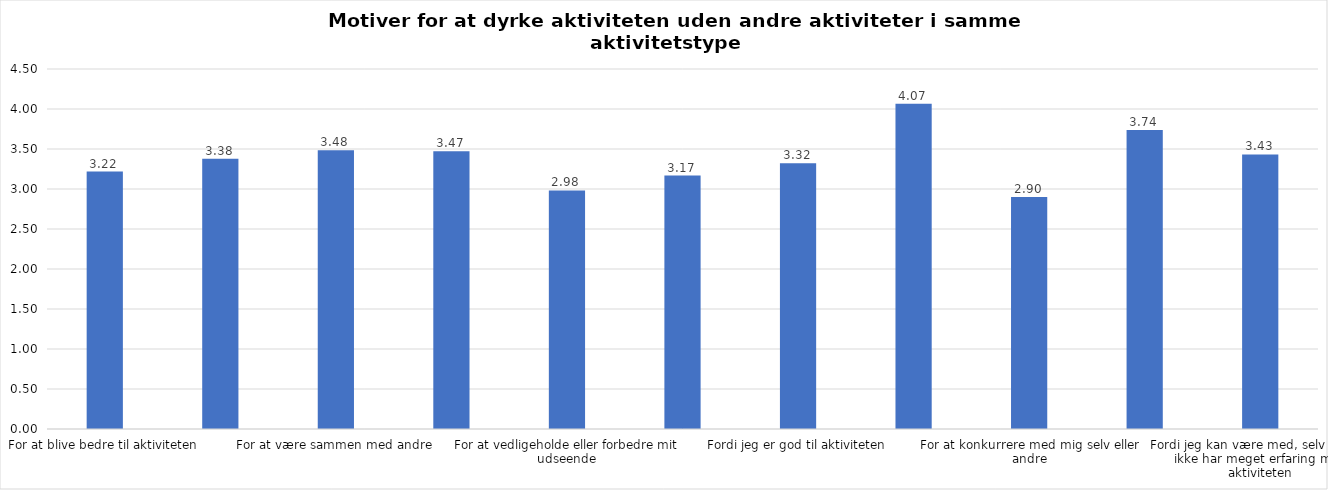
| Category | Gennemsnit |
|---|---|
| For at blive bedre til aktiviteten | 3.217 |
| For at vedligeholde eller forbedre min sundhed (fx helbred, fysisk form) | 3.379 |
| For at være sammen med andre | 3.484 |
| For at gøre noget godt for mig selv | 3.472 |
| For at vedligeholde eller forbedre mit udseende | 2.981 |
| Fordi andre i min omgangskreds opmuntrer mig til det | 3.168 |
| Fordi jeg er god til aktiviteten | 3.323 |
| Fordi jeg godt kan lide aktiviteten | 4.065 |
| For at konkurrere med mig selv eller andre | 2.901 |
| Fordi aktiviteten passer godt ind i min hverdag | 3.736 |
| Fordi jeg kan være med, selv om jeg ikke har meget erfaring med aktiviteten | 3.432 |